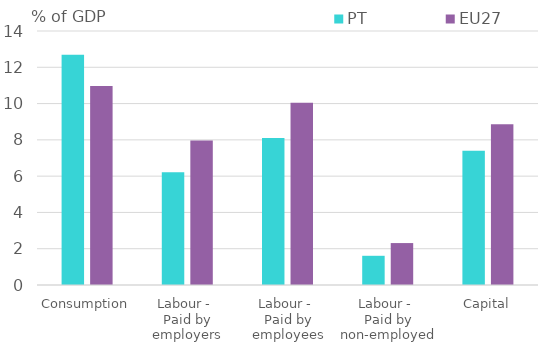
| Category | PT | EU27 |
|---|---|---|
| Consumption | 12.689 | 10.967 |
| Labour - 
Paid by employers | 6.208 | 7.966 |
| Labour - 
Paid by employees | 8.101 | 10.052 |
| Labour - 
Paid by non-employed | 1.61 | 2.311 |
| Capital | 7.398 | 8.858 |